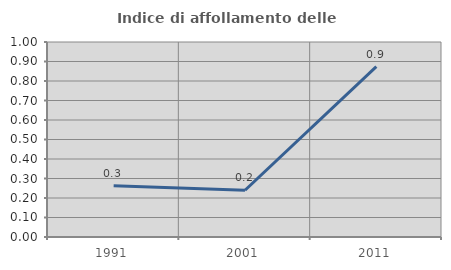
| Category | Indice di affollamento delle abitazioni  |
|---|---|
| 1991.0 | 0.263 |
| 2001.0 | 0.24 |
| 2011.0 | 0.873 |